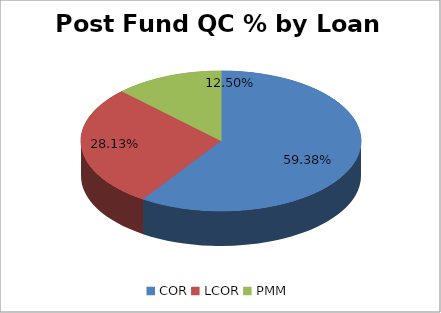
| Category | Post-Closing QC % (Current Month) |
|---|---|
| COR | 0.594 |
| LCOR | 0.281 |
| PMM | 0.125 |